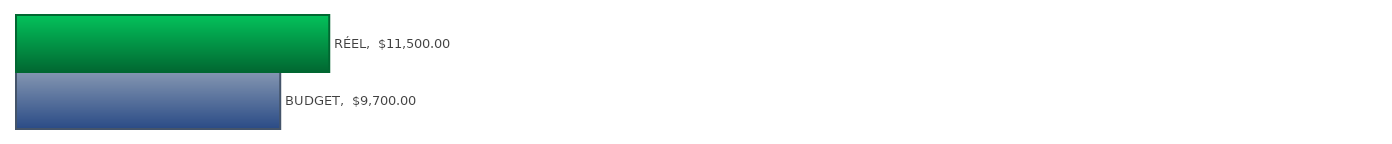
| Category | Series 0 |
|---|---|
| BUDGET | 9700 |
| RÉEL | 11500 |